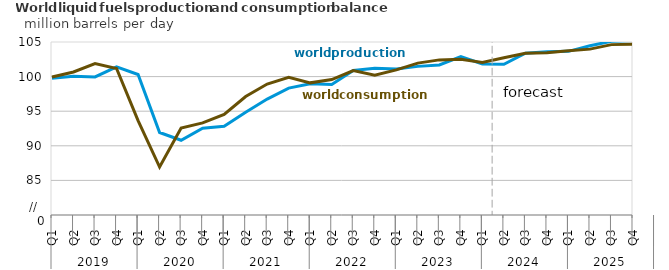
| Category | World production | World consumption |
|---|---|---|
| 0 | 99.755 | 99.941 |
| 1900-01-01 | 100.056 | 100.666 |
| 1900-01-02 | 99.953 | 101.872 |
| 1900-01-03 | 101.415 | 101.169 |
| 1900-01-04 | 100.302 | 93.642 |
| 1900-01-05 | 91.918 | 86.929 |
| 1900-01-06 | 90.802 | 92.563 |
| 1900-01-07 | 92.542 | 93.305 |
| 1900-01-08 | 92.814 | 94.521 |
| 1900-01-09 | 94.837 | 97.124 |
| 1900-01-10 | 96.755 | 98.921 |
| 1900-01-11 | 98.34 | 99.906 |
| 1900-01-12 | 98.964 | 99.097 |
| 1900-01-13 | 98.864 | 99.568 |
| 1900-01-14 | 100.885 | 100.87 |
| 1900-01-15 | 101.196 | 100.206 |
| 1900-01-16 | 101.106 | 100.967 |
| 1900-01-17 | 101.478 | 101.952 |
| 1900-01-18 | 101.689 | 102.415 |
| 1900-01-19 | 102.903 | 102.5 |
| 1900-01-20 | 101.819 | 102.055 |
| 1900-01-21 | 101.787 | 102.726 |
| 1900-01-22 | 103.384 | 103.386 |
| 1900-01-23 | 103.586 | 103.446 |
| 1900-01-24 | 103.651 | 103.744 |
| 1900-01-25 | 104.448 | 103.97 |
| 1900-01-26 | 105.12 | 104.621 |
| 1900-01-27 | 105.213 | 104.696 |